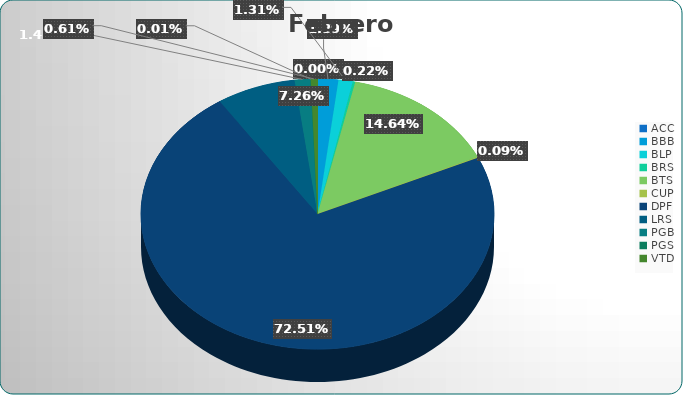
| Category | Series 0 |
|---|---|
| ACC | 23206.86 |
| BBB | 11300382.7 |
| BLP | 7843749.9 |
| BRS | 1311919.56 |
| BTS | 87463556.86 |
| CUP | 535320.7 |
| DPF | 433294552.42 |
| LRS | 43354435.33 |
| PGB | 8682658.3 |
| PGS | 87781.34 |
| VTD | 3661576.62 |